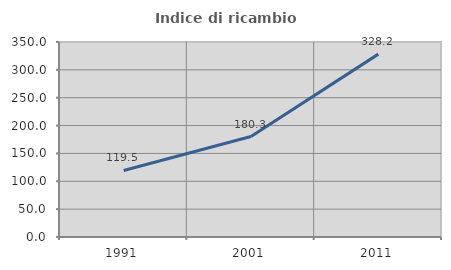
| Category | Indice di ricambio occupazionale  |
|---|---|
| 1991.0 | 119.454 |
| 2001.0 | 180.258 |
| 2011.0 | 328.241 |